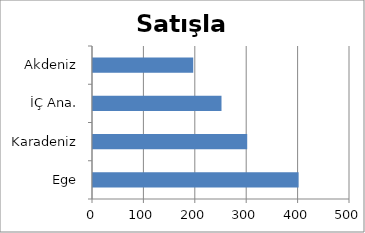
| Category | Satışlar |
|---|---|
| Ege | 400 |
| Karadeniz | 300 |
| İÇ Ana. | 250 |
| Akdeniz | 195 |